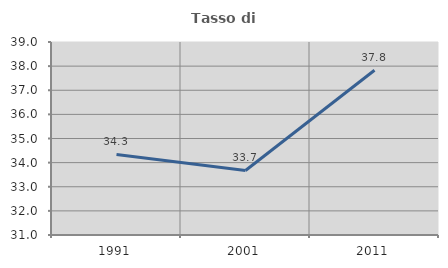
| Category | Tasso di occupazione   |
|---|---|
| 1991.0 | 34.34 |
| 2001.0 | 33.676 |
| 2011.0 | 37.828 |